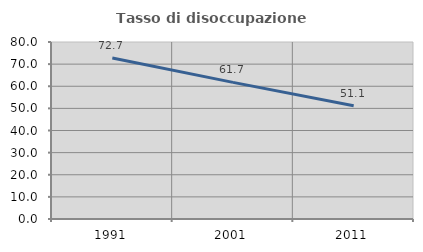
| Category | Tasso di disoccupazione giovanile  |
|---|---|
| 1991.0 | 72.736 |
| 2001.0 | 61.74 |
| 2011.0 | 51.148 |